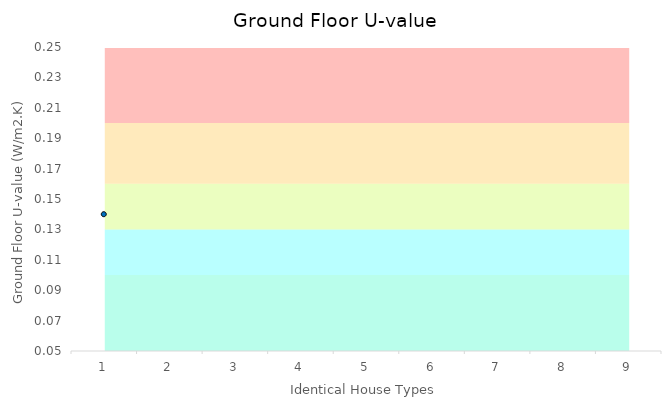
| Category | Series 0 | Series 1 | Series 2 | Series 3 | Series 4 |
|---|---|---|---|---|---|
| 0 | 0.1 | 0.03 | 0.03 | 0.04 | 0.05 |
| 1 | 0.1 | 0.03 | 0.03 | 0.04 | 0.05 |
| 2 | 0.1 | 0.03 | 0.03 | 0.04 | 0.05 |
| 3 | 0.1 | 0.03 | 0.03 | 0.04 | 0.05 |
| 4 | 0.1 | 0.03 | 0.03 | 0.04 | 0.05 |
| 5 | 0.1 | 0.03 | 0.03 | 0.04 | 0.05 |
| 6 | 0.1 | 0.03 | 0.03 | 0.04 | 0.05 |
| 7 | 0.1 | 0.03 | 0.03 | 0.04 | 0.05 |
| 8 | 0.1 | 0.03 | 0.03 | 0.04 | 0.05 |